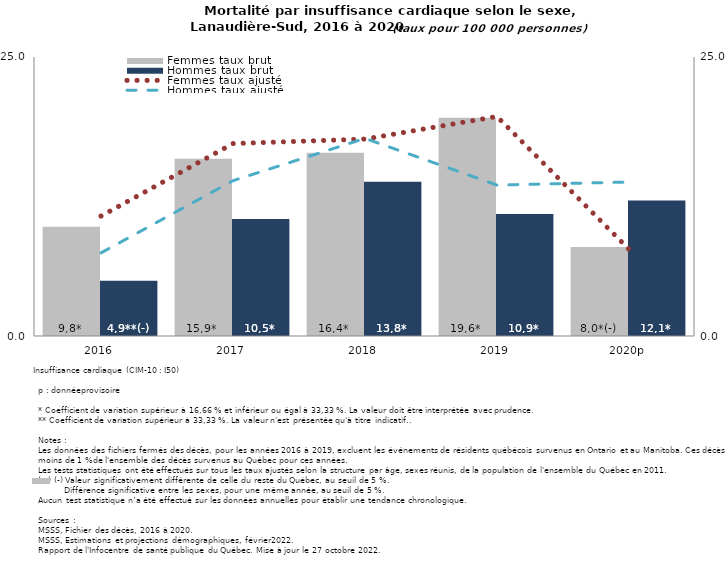
| Category | Femmes taux brut | Hommes taux brut |
|---|---|---|
| 2016 | 9.79 | 4.947 |
| 2017 | 15.891 | 10.494 |
| 2018 | 16.419 | 13.829 |
| 2019 | 19.56 | 10.924 |
| 2020p | 7.979 | 12.139 |